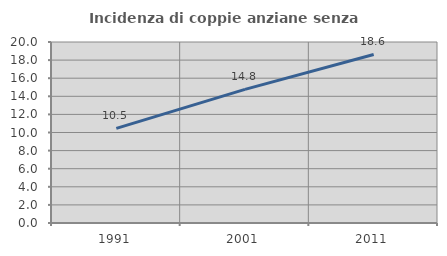
| Category | Incidenza di coppie anziane senza figli  |
|---|---|
| 1991.0 | 10.459 |
| 2001.0 | 14.771 |
| 2011.0 | 18.624 |